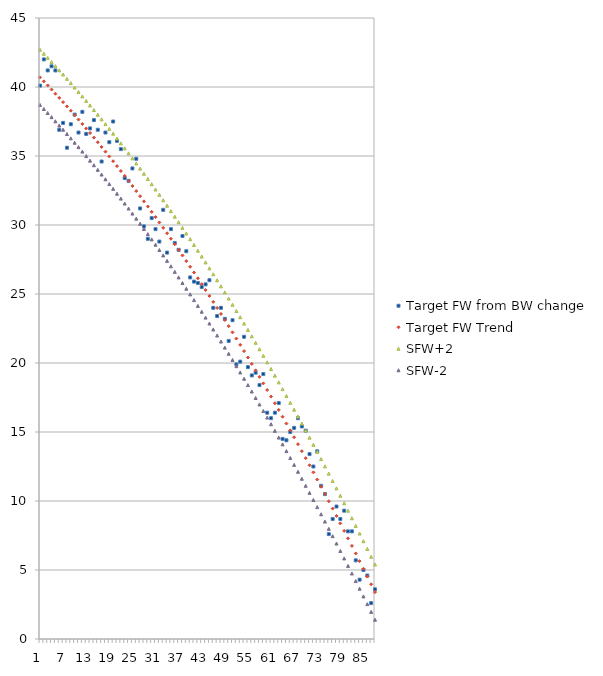
| Category | Target FW from BW change | Target FW Trend | SFW+2 | SFW-2 |
|---|---|---|---|---|
| 0 | 40.1 | 40.699 | 42.699 | 38.699 |
| 1 | 42 | 40.408 | 42.408 | 38.408 |
| 2 | 41.2 | 40.114 | 42.114 | 38.114 |
| 3 | 41.5 | 39.816 | 41.816 | 37.816 |
| 4 | 41.2 | 39.515 | 41.515 | 37.515 |
| 5 | 36.9 | 39.211 | 41.211 | 37.211 |
| 6 | 37.4 | 38.904 | 40.904 | 36.904 |
| 7 | 35.6 | 38.594 | 40.594 | 36.594 |
| 8 | 37.3 | 38.28 | 40.28 | 36.28 |
| 9 | 38 | 37.964 | 39.964 | 35.964 |
| 10 | 36.7 | 37.644 | 39.644 | 35.644 |
| 11 | 38.2 | 37.32 | 39.32 | 35.32 |
| 12 | 36.6 | 36.994 | 38.994 | 34.994 |
| 13 | 37 | 36.664 | 38.664 | 34.664 |
| 14 | 37.6 | 36.332 | 38.332 | 34.332 |
| 15 | 36.9 | 35.996 | 37.996 | 33.996 |
| 16 | 34.6 | 35.657 | 37.657 | 33.657 |
| 17 | 36.7 | 35.314 | 37.314 | 33.314 |
| 18 | 36 | 34.969 | 36.969 | 32.969 |
| 19 | 37.5 | 34.62 | 36.62 | 32.62 |
| 20 | 36.1 | 34.268 | 36.268 | 32.268 |
| 21 | 35.5 | 33.913 | 35.913 | 31.913 |
| 22 | 33.4 | 33.555 | 35.555 | 31.555 |
| 23 | 33.2 | 33.193 | 35.193 | 31.193 |
| 24 | 34.1 | 32.828 | 34.828 | 30.828 |
| 25 | 34.8 | 32.46 | 34.46 | 30.46 |
| 26 | 31.2 | 32.089 | 34.089 | 30.089 |
| 27 | 29.9 | 31.715 | 33.715 | 29.715 |
| 28 | 29 | 31.337 | 33.337 | 29.337 |
| 29 | 30.5 | 30.956 | 32.956 | 28.956 |
| 30 | 29.7 | 30.573 | 32.573 | 28.573 |
| 31 | 28.8 | 30.185 | 32.185 | 28.185 |
| 32 | 31.1 | 29.795 | 31.795 | 27.795 |
| 33 | 28 | 29.402 | 31.402 | 27.402 |
| 34 | 29.7 | 29.005 | 31.005 | 27.005 |
| 35 | 28.7 | 28.605 | 30.605 | 26.605 |
| 36 | 28.2 | 28.202 | 30.202 | 26.202 |
| 37 | 29.2 | 27.795 | 29.795 | 25.795 |
| 38 | 28.1 | 27.386 | 29.386 | 25.386 |
| 39 | 26.2 | 26.973 | 28.973 | 24.973 |
| 40 | 25.9 | 26.557 | 28.557 | 24.557 |
| 41 | 25.8 | 26.138 | 28.138 | 24.138 |
| 42 | 25.5 | 25.716 | 27.716 | 23.716 |
| 43 | 25.7 | 25.29 | 27.29 | 23.29 |
| 44 | 26 | 24.861 | 26.861 | 22.861 |
| 45 | 24 | 24.429 | 26.429 | 22.429 |
| 46 | 23.4 | 23.994 | 25.994 | 21.994 |
| 47 | 24 | 23.556 | 25.556 | 21.556 |
| 48 | 23.2 | 23.114 | 25.114 | 21.114 |
| 49 | 21.6 | 22.67 | 24.67 | 20.67 |
| 50 | 23.1 | 22.222 | 24.222 | 20.222 |
| 51 | 19.9 | 21.77 | 23.77 | 19.77 |
| 52 | 20.1 | 21.316 | 23.316 | 19.316 |
| 53 | 21.9 | 20.858 | 22.858 | 18.858 |
| 54 | 19.7 | 20.398 | 22.398 | 18.398 |
| 55 | 19.1 | 19.934 | 21.934 | 17.934 |
| 56 | 19.3 | 19.467 | 21.467 | 17.467 |
| 57 | 18.4 | 18.996 | 20.996 | 16.996 |
| 58 | 19.2 | 18.523 | 20.523 | 16.523 |
| 59 | 16.4 | 18.046 | 20.046 | 16.046 |
| 60 | 16 | 17.566 | 19.566 | 15.566 |
| 61 | 16.4 | 17.083 | 19.083 | 15.083 |
| 62 | 17.1 | 16.597 | 18.597 | 14.597 |
| 63 | 14.5 | 16.107 | 18.107 | 14.107 |
| 64 | 14.4 | 15.614 | 17.614 | 13.614 |
| 65 | 15 | 15.118 | 17.118 | 13.118 |
| 66 | 15.3 | 14.619 | 16.619 | 12.619 |
| 67 | 16 | 14.117 | 16.117 | 12.117 |
| 68 | 15.4 | 13.611 | 15.611 | 11.611 |
| 69 | 15.1 | 13.102 | 15.102 | 11.102 |
| 70 | 13.4 | 12.591 | 14.591 | 10.591 |
| 71 | 12.5 | 12.075 | 14.075 | 10.075 |
| 72 | 13.6 | 11.557 | 13.557 | 9.557 |
| 73 | 11.1 | 11.036 | 13.036 | 9.036 |
| 74 | 10.5 | 10.511 | 12.511 | 8.511 |
| 75 | 7.6 | 9.983 | 11.983 | 7.983 |
| 76 | 8.7 | 9.452 | 11.452 | 7.452 |
| 77 | 9.6 | 8.917 | 10.917 | 6.917 |
| 78 | 8.7 | 8.38 | 10.38 | 6.38 |
| 79 | 9.3 | 7.839 | 9.839 | 5.839 |
| 80 | 7.8 | 7.295 | 9.295 | 5.295 |
| 81 | 7.8 | 6.748 | 8.748 | 4.748 |
| 82 | 5.7 | 6.198 | 8.198 | 4.198 |
| 83 | 4.3 | 5.644 | 7.644 | 3.644 |
| 84 | 5 | 5.087 | 7.087 | 3.087 |
| 85 | 4.6 | 4.527 | 6.527 | 2.527 |
| 86 | 2.6 | 3.964 | 5.964 | 1.964 |
| 87 | 3.6 | 3.398 | 5.398 | 1.398 |